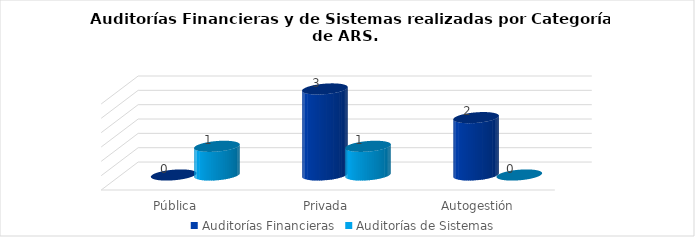
| Category | Auditorías Financieras | Auditorías de Sistemas |
|---|---|---|
| Pública | 0 | 1 |
| Privada | 3 | 1 |
| Autogestión | 2 | 0 |